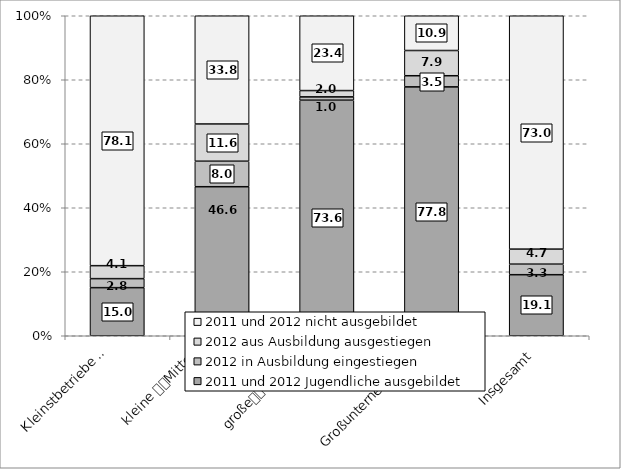
| Category | 2011 und 2012 Jugendliche ausgebildet | 2012 in Ausbildung eingestiegen | 2012 aus Ausbildung ausgestiegen | 2011 und 2012 nicht ausgebildet |
|---|---|---|---|---|
| Kleinstbetriebe 
(1 bis 19) | 15.03 | 2.82 | 4.05 | 78.1 |
| kleine 
Mittelständler 
(20 bis 99) | 46.58 | 7.97 | 11.63 | 33.83 |
| große
 Mittelständler 
(100 bis 199) | 73.61 | 1.04 | 1.97 | 23.38 |
| Großunternehmen 
(>= 200) | 77.77 | 3.48 | 7.88 | 10.86 |
| Insgesamt | 19.1 | 3.3 | 4.7 | 73 |